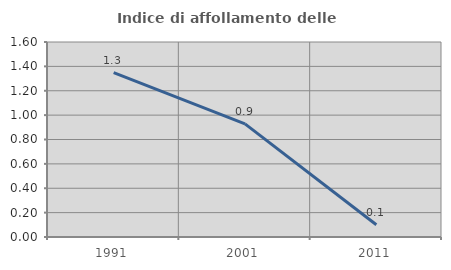
| Category | Indice di affollamento delle abitazioni  |
|---|---|
| 1991.0 | 1.349 |
| 2001.0 | 0.928 |
| 2011.0 | 0.101 |